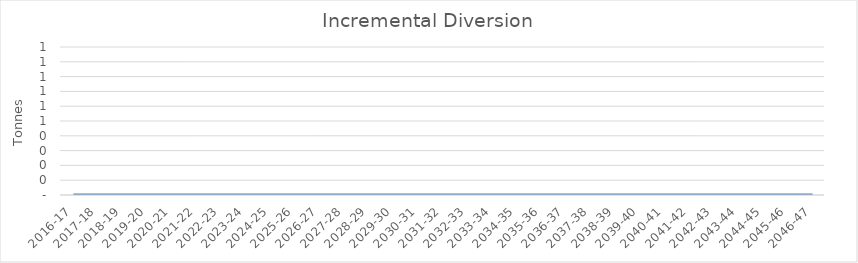
| Category | Series 0 |
|---|---|
| 2016-17 | 0 |
| 2017-18 | 0 |
| 2018-19 | 0 |
| 2019-20 | 0 |
| 2020-21 | 0 |
| 2021-22 | 0 |
| 2022-23 | 0 |
| 2023-24 | 0 |
| 2024-25 | 0 |
| 2025-26 | 0 |
| 2026-27 | 0 |
| 2027-28 | 0 |
| 2028-29 | 0 |
| 2029-30 | 0 |
| 2030-31 | 0 |
| 2031-32 | 0 |
| 2032-33 | 0 |
| 2033-34 | 0 |
| 2034-35 | 0 |
| 2035-36 | 0 |
| 2036-37 | 0 |
| 2037-38 | 0 |
| 2038-39 | 0 |
| 2039-40 | 0 |
| 2040-41 | 0 |
| 2041-42 | 0 |
| 2042-43 | 0 |
| 2043-44 | 0 |
| 2044-45 | 0 |
| 2045-46 | 0 |
| 2046-47 | 0 |